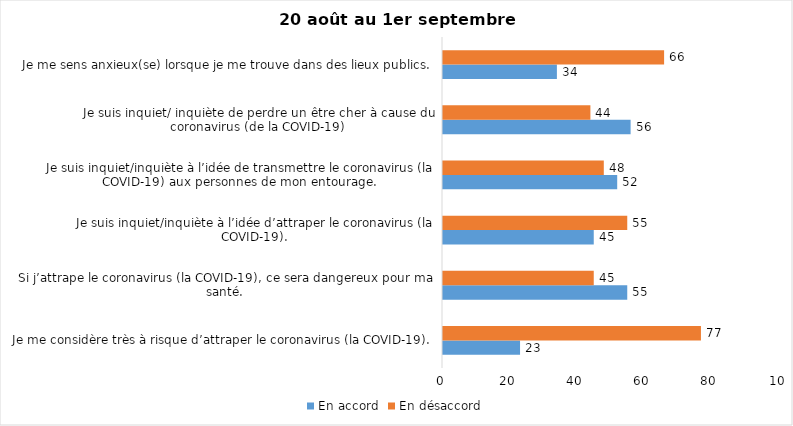
| Category | En accord | En désaccord |
|---|---|---|
| Je me considère très à risque d’attraper le coronavirus (la COVID-19). | 23 | 77 |
| Si j’attrape le coronavirus (la COVID-19), ce sera dangereux pour ma santé. | 55 | 45 |
| Je suis inquiet/inquiète à l’idée d’attraper le coronavirus (la COVID-19). | 45 | 55 |
| Je suis inquiet/inquiète à l’idée de transmettre le coronavirus (la COVID-19) aux personnes de mon entourage. | 52 | 48 |
| Je suis inquiet/ inquiète de perdre un être cher à cause du coronavirus (de la COVID-19) | 56 | 44 |
| Je me sens anxieux(se) lorsque je me trouve dans des lieux publics. | 34 | 66 |